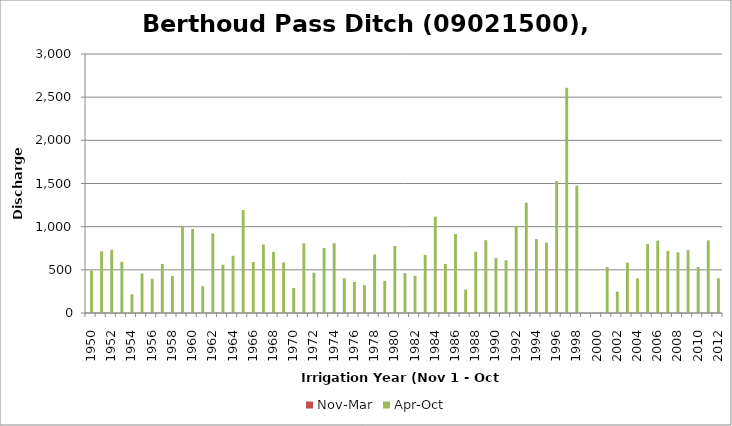
| Category | Nov-Mar | Apr-Oct |
|---|---|---|
| 1950.0 | 0 | 490.32 |
| 1951.0 | 0 | 716.24 |
| 1952.0 | 0 | 731.71 |
| 1953.0 | 0 | 593.26 |
| 1954.0 | 0 | 216.99 |
| 1955.0 | 0 | 458.19 |
| 1956.0 | 0 | 395.9 |
| 1957.0 | 0 | 568.47 |
| 1958.0 | 0 | 429.63 |
| 1959.0 | 0 | 996.71 |
| 1960.0 | 0 | 973.1 |
| 1961.0 | 0 | 310.22 |
| 1962.0 | 0 | 921.93 |
| 1963.0 | 0 | 558.74 |
| 1964.0 | 0 | 662.89 |
| 1965.0 | 0 | 1192.09 |
| 1966.0 | 0 | 590.7 |
| 1967.0 | 0 | 793.19 |
| 1968.0 | 0 | 707.91 |
| 1969.0 | 0 | 586.22 |
| 1970.0 | 0 | 291.32 |
| 1971.0 | 0 | 805.89 |
| 1972.0 | 0 | 466.01 |
| 1973.0 | 0 | 753.33 |
| 1974.0 | 0 | 808.54 |
| 1975.0 | 0 | 402.06 |
| 1976.0 | 0 | 359.21 |
| 1977.0 | 0 | 322.12 |
| 1978.0 | 0 | 677.63 |
| 1979.0 | 0 | 372.8 |
| 1980.0 | 0 | 777.05 |
| 1981.0 | 0 | 462.69 |
| 1982.0 | 0 | 431.06 |
| 1983.0 | 0 | 673.91 |
| 1984.0 | 0 | 1116.44 |
| 1985.0 | 0 | 566.96 |
| 1986.0 | 0 | 914.08 |
| 1987.0 | 0 | 270.65 |
| 1988.0 | 0 | 709.94 |
| 1989.0 | 0 | 843.21 |
| 1990.0 | 0 | 636.59 |
| 1991.0 | 0 | 610.38 |
| 1992.0 | 0 | 1009.1 |
| 1993.0 | 0 | 1276.75 |
| 1994.0 | 0 | 855.26 |
| 1995.0 | 0 | 814.89 |
| 1996.0 | 0 | 1528.51 |
| 1997.0 | 0 | 2608.28 |
| 1998.0 | 0 | 1475.21 |
| 1999.0 | 0 | 0 |
| 2000.0 | 0 | 0 |
| 2001.0 | 0 | 531.5 |
| 2002.0 | 0 | 246.94 |
| 2003.0 | 0 | 584.46 |
| 2004.0 | 0 | 401.14 |
| 2005.0 | 0 | 800.66 |
| 2006.0 | 0 | 838.77 |
| 2007.0 | 0 | 719.01 |
| 2008.0 | 0 | 702.81 |
| 2009.0 | 0 | 728.42 |
| 2010.0 | 0 | 533.01 |
| 2011.0 | 0 | 841.03 |
| 2012.0 | 0 | 402.83 |